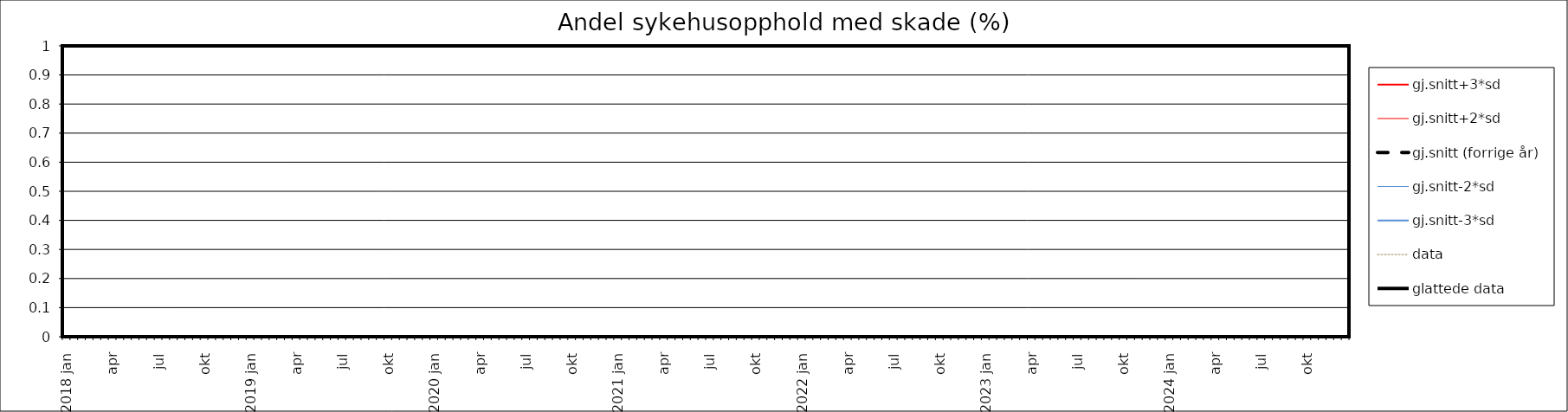
| Category | gj.snitt+3*sd | gj.snitt+2*sd | gj.snitt (forrige år) | gj.snitt-2*sd | gj.snitt-3*sd | data | glattede data |
|---|---|---|---|---|---|---|---|
| 2018 jan | 0 | 0 | 0 | 0 | 0 | 0 | 0 |
|  | 0 | 0 | 0 | 0 | 0 | 0 | 0 |
| feb | 0 | 0 | 0 | 0 | 0 | 0 | 0 |
|  | 0 | 0 | 0 | 0 | 0 | 0 | 0 |
| mar | 0 | 0 | 0 | 0 | 0 | 0 | 0 |
|  | 0 | 0 | 0 | 0 | 0 | 0 | 0 |
| apr | 0 | 0 | 0 | 0 | 0 | 0 | 0 |
|  | 0 | 0 | 0 | 0 | 0 | 0 | 0 |
| mai | 0 | 0 | 0 | 0 | 0 | 0 | 0 |
|  | 0 | 0 | 0 | 0 | 0 | 0 | 0 |
| jun | 0 | 0 | 0 | 0 | 0 | 0 | 0 |
|  | 0 | 0 | 0 | 0 | 0 | 0 | 0 |
| jul | 0 | 0 | 0 | 0 | 0 | 0 | 0 |
|  | 0 | 0 | 0 | 0 | 0 | 0 | 0 |
| aug | 0 | 0 | 0 | 0 | 0 | 0 | 0 |
|  | 0 | 0 | 0 | 0 | 0 | 0 | 0 |
| sep | 0 | 0 | 0 | 0 | 0 | 0 | 0 |
|  | 0 | 0 | 0 | 0 | 0 | 0 | 0 |
| okt | 0 | 0 | 0 | 0 | 0 | 0 | 0 |
|  | 0 | 0 | 0 | 0 | 0 | 0 | 0 |
| nov | 0 | 0 | 0 | 0 | 0 | 0 | 0 |
|  | 0 | 0 | 0 | 0 | 0 | 0 | 0 |
| des | 0 | 0 | 0 | 0 | 0 | 0 | 0 |
|  | 0 | 0 | 0 | 0 | 0 | 0 | 0 |
| 2019 jan | 0 | 0 | 0 | 0 | 0 | 0 | 0 |
|  | 0 | 0 | 0 | 0 | 0 | 0 | 0 |
| feb | 0 | 0 | 0 | 0 | 0 | 0 | 0 |
|  | 0 | 0 | 0 | 0 | 0 | 0 | 0 |
| mar | 0 | 0 | 0 | 0 | 0 | 0 | 0 |
|  | 0 | 0 | 0 | 0 | 0 | 0 | 0 |
| apr | 0 | 0 | 0 | 0 | 0 | 0 | 0 |
|  | 0 | 0 | 0 | 0 | 0 | 0 | 0 |
| mai | 0 | 0 | 0 | 0 | 0 | 0 | 0 |
|  | 0 | 0 | 0 | 0 | 0 | 0 | 0 |
| jun | 0 | 0 | 0 | 0 | 0 | 0 | 0 |
|  | 0 | 0 | 0 | 0 | 0 | 0 | 0 |
| jul | 0 | 0 | 0 | 0 | 0 | 0 | 0 |
|  | 0 | 0 | 0 | 0 | 0 | 0 | 0 |
| aug | 0 | 0 | 0 | 0 | 0 | 0 | 0 |
|  | 0 | 0 | 0 | 0 | 0 | 0 | 0 |
| sep | 0 | 0 | 0 | 0 | 0 | 0 | 0 |
|  | 0 | 0 | 0 | 0 | 0 | 0 | 0 |
| okt | 0 | 0 | 0 | 0 | 0 | 0 | 0 |
|  | 0 | 0 | 0 | 0 | 0 | 0 | 0 |
| nov | 0 | 0 | 0 | 0 | 0 | 0 | 0 |
|  | 0 | 0 | 0 | 0 | 0 | 0 | 0 |
| des | 0 | 0 | 0 | 0 | 0 | 0 | 0 |
|  | 0 | 0 | 0 | 0 | 0 | 0 | 0 |
| 2020 jan | 0 | 0 | 0 | 0 | 0 | 0 | 0 |
|  | 0 | 0 | 0 | 0 | 0 | 0 | 0 |
| feb | 0 | 0 | 0 | 0 | 0 | 0 | 0 |
|  | 0 | 0 | 0 | 0 | 0 | 0 | 0 |
| mar | 0 | 0 | 0 | 0 | 0 | 0 | 0 |
|  | 0 | 0 | 0 | 0 | 0 | 0 | 0 |
| apr | 0 | 0 | 0 | 0 | 0 | 0 | 0 |
|  | 0 | 0 | 0 | 0 | 0 | 0 | 0 |
| mai | 0 | 0 | 0 | 0 | 0 | 0 | 0 |
|  | 0 | 0 | 0 | 0 | 0 | 0 | 0 |
| jun | 0 | 0 | 0 | 0 | 0 | 0 | 0 |
|  | 0 | 0 | 0 | 0 | 0 | 0 | 0 |
| jul | 0 | 0 | 0 | 0 | 0 | 0 | 0 |
|  | 0 | 0 | 0 | 0 | 0 | 0 | 0 |
| aug | 0 | 0 | 0 | 0 | 0 | 0 | 0 |
|  | 0 | 0 | 0 | 0 | 0 | 0 | 0 |
| sep | 0 | 0 | 0 | 0 | 0 | 0 | 0 |
|  | 0 | 0 | 0 | 0 | 0 | 0 | 0 |
| okt | 0 | 0 | 0 | 0 | 0 | 0 | 0 |
|  | 0 | 0 | 0 | 0 | 0 | 0 | 0 |
| nov | 0 | 0 | 0 | 0 | 0 | 0 | 0 |
|  | 0 | 0 | 0 | 0 | 0 | 0 | 0 |
| des | 0 | 0 | 0 | 0 | 0 | 0 | 0 |
|  | 0 | 0 | 0 | 0 | 0 | 0 | 0 |
| 2021 jan | 0 | 0 | 0 | 0 | 0 | 0 | 0 |
|  | 0 | 0 | 0 | 0 | 0 | 0 | 0 |
| feb | 0 | 0 | 0 | 0 | 0 | 0 | 0 |
|  | 0 | 0 | 0 | 0 | 0 | 0 | 0 |
| mar | 0 | 0 | 0 | 0 | 0 | 0 | 0 |
|  | 0 | 0 | 0 | 0 | 0 | 0 | 0 |
| apr | 0 | 0 | 0 | 0 | 0 | 0 | 0 |
|  | 0 | 0 | 0 | 0 | 0 | 0 | 0 |
| mai | 0 | 0 | 0 | 0 | 0 | 0 | 0 |
|  | 0 | 0 | 0 | 0 | 0 | 0 | 0 |
| jun | 0 | 0 | 0 | 0 | 0 | 0 | 0 |
|  | 0 | 0 | 0 | 0 | 0 | 0 | 0 |
| jul | 0 | 0 | 0 | 0 | 0 | 0 | 0 |
|  | 0 | 0 | 0 | 0 | 0 | 0 | 0 |
| aug | 0 | 0 | 0 | 0 | 0 | 0 | 0 |
|  | 0 | 0 | 0 | 0 | 0 | 0 | 0 |
| sep | 0 | 0 | 0 | 0 | 0 | 0 | 0 |
|  | 0 | 0 | 0 | 0 | 0 | 0 | 0 |
| okt | 0 | 0 | 0 | 0 | 0 | 0 | 0 |
|  | 0 | 0 | 0 | 0 | 0 | 0 | 0 |
| nov | 0 | 0 | 0 | 0 | 0 | 0 | 0 |
|  | 0 | 0 | 0 | 0 | 0 | 0 | 0 |
| des | 0 | 0 | 0 | 0 | 0 | 0 | 0 |
|  | 0 | 0 | 0 | 0 | 0 | 0 | 0 |
| 2022 jan | 0 | 0 | 0 | 0 | 0 | 0 | 0 |
|  | 0 | 0 | 0 | 0 | 0 | 0 | 0 |
| feb | 0 | 0 | 0 | 0 | 0 | 0 | 0 |
|  | 0 | 0 | 0 | 0 | 0 | 0 | 0 |
| mar | 0 | 0 | 0 | 0 | 0 | 0 | 0 |
|  | 0 | 0 | 0 | 0 | 0 | 0 | 0 |
| apr | 0 | 0 | 0 | 0 | 0 | 0 | 0 |
|  | 0 | 0 | 0 | 0 | 0 | 0 | 0 |
| mai | 0 | 0 | 0 | 0 | 0 | 0 | 0 |
|  | 0 | 0 | 0 | 0 | 0 | 0 | 0 |
| jun | 0 | 0 | 0 | 0 | 0 | 0 | 0 |
|  | 0 | 0 | 0 | 0 | 0 | 0 | 0 |
| jul | 0 | 0 | 0 | 0 | 0 | 0 | 0 |
|  | 0 | 0 | 0 | 0 | 0 | 0 | 0 |
| aug | 0 | 0 | 0 | 0 | 0 | 0 | 0 |
|  | 0 | 0 | 0 | 0 | 0 | 0 | 0 |
| sep | 0 | 0 | 0 | 0 | 0 | 0 | 0 |
|  | 0 | 0 | 0 | 0 | 0 | 0 | 0 |
| okt | 0 | 0 | 0 | 0 | 0 | 0 | 0 |
|  | 0 | 0 | 0 | 0 | 0 | 0 | 0 |
| nov | 0 | 0 | 0 | 0 | 0 | 0 | 0 |
|  | 0 | 0 | 0 | 0 | 0 | 0 | 0 |
| des | 0 | 0 | 0 | 0 | 0 | 0 | 0 |
|  | 0 | 0 | 0 | 0 | 0 | 0 | 0 |
| 2023 jan | 0 | 0 | 0 | 0 | 0 | 0 | 0 |
|  | 0 | 0 | 0 | 0 | 0 | 0 | 0 |
| feb | 0 | 0 | 0 | 0 | 0 | 0 | 0 |
|  | 0 | 0 | 0 | 0 | 0 | 0 | 0 |
| mar | 0 | 0 | 0 | 0 | 0 | 0 | 0 |
|  | 0 | 0 | 0 | 0 | 0 | 0 | 0 |
| apr | 0 | 0 | 0 | 0 | 0 | 0 | 0 |
|  | 0 | 0 | 0 | 0 | 0 | 0 | 0 |
| mai | 0 | 0 | 0 | 0 | 0 | 0 | 0 |
|  | 0 | 0 | 0 | 0 | 0 | 0 | 0 |
| jun | 0 | 0 | 0 | 0 | 0 | 0 | 0 |
|  | 0 | 0 | 0 | 0 | 0 | 0 | 0 |
| jul | 0 | 0 | 0 | 0 | 0 | 0 | 0 |
|  | 0 | 0 | 0 | 0 | 0 | 0 | 0 |
| aug | 0 | 0 | 0 | 0 | 0 | 0 | 0 |
|  | 0 | 0 | 0 | 0 | 0 | 0 | 0 |
| sep | 0 | 0 | 0 | 0 | 0 | 0 | 0 |
|  | 0 | 0 | 0 | 0 | 0 | 0 | 0 |
| okt | 0 | 0 | 0 | 0 | 0 | 0 | 0 |
|  | 0 | 0 | 0 | 0 | 0 | 0 | 0 |
| nov | 0 | 0 | 0 | 0 | 0 | 0 | 0 |
|  | 0 | 0 | 0 | 0 | 0 | 0 | 0 |
| des | 0 | 0 | 0 | 0 | 0 | 0 | 0 |
|  | 0 | 0 | 0 | 0 | 0 | 0 | 0 |
| 2024 jan | 0 | 0 | 0 | 0 | 0 | 0 | 0 |
|  | 0 | 0 | 0 | 0 | 0 | 0 | 0 |
| feb | 0 | 0 | 0 | 0 | 0 | 0 | 0 |
|  | 0 | 0 | 0 | 0 | 0 | 0 | 0 |
| mar | 0 | 0 | 0 | 0 | 0 | 0 | 0 |
|  | 0 | 0 | 0 | 0 | 0 | 0 | 0 |
| apr | 0 | 0 | 0 | 0 | 0 | 0 | 0 |
|  | 0 | 0 | 0 | 0 | 0 | 0 | 0 |
| mai | 0 | 0 | 0 | 0 | 0 | 0 | 0 |
|  | 0 | 0 | 0 | 0 | 0 | 0 | 0 |
| jun | 0 | 0 | 0 | 0 | 0 | 0 | 0 |
|  | 0 | 0 | 0 | 0 | 0 | 0 | 0 |
| jul | 0 | 0 | 0 | 0 | 0 | 0 | 0 |
|  | 0 | 0 | 0 | 0 | 0 | 0 | 0 |
| aug | 0 | 0 | 0 | 0 | 0 | 0 | 0 |
|  | 0 | 0 | 0 | 0 | 0 | 0 | 0 |
| sep | 0 | 0 | 0 | 0 | 0 | 0 | 0 |
|  | 0 | 0 | 0 | 0 | 0 | 0 | 0 |
| okt | 0 | 0 | 0 | 0 | 0 | 0 | 0 |
|  | 0 | 0 | 0 | 0 | 0 | 0 | 0 |
| nov | 0 | 0 | 0 | 0 | 0 | 0 | 0 |
|  | 0 | 0 | 0 | 0 | 0 | 0 | 0 |
| des | 0 | 0 | 0 | 0 | 0 | 0 | 0 |